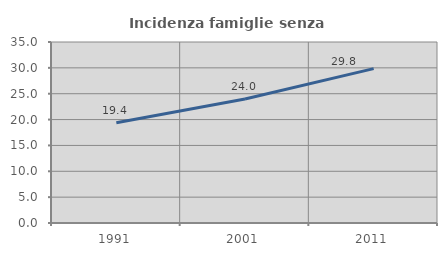
| Category | Incidenza famiglie senza nuclei |
|---|---|
| 1991.0 | 19.367 |
| 2001.0 | 23.971 |
| 2011.0 | 29.845 |